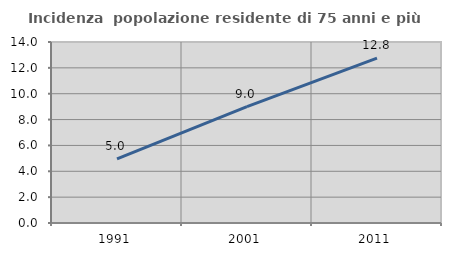
| Category | Incidenza  popolazione residente di 75 anni e più |
|---|---|
| 1991.0 | 4.962 |
| 2001.0 | 8.997 |
| 2011.0 | 12.758 |